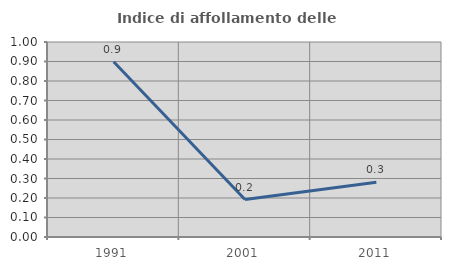
| Category | Indice di affollamento delle abitazioni  |
|---|---|
| 1991.0 | 0.899 |
| 2001.0 | 0.192 |
| 2011.0 | 0.281 |